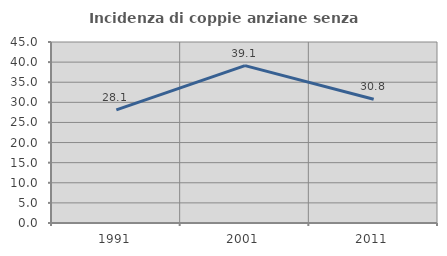
| Category | Incidenza di coppie anziane senza figli  |
|---|---|
| 1991.0 | 28.125 |
| 2001.0 | 39.13 |
| 2011.0 | 30.769 |